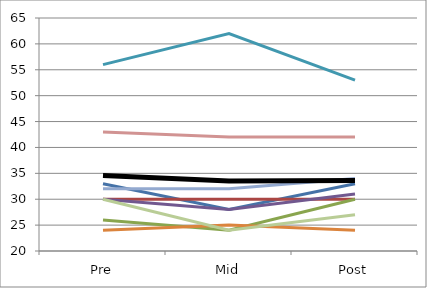
| Category | Series 0 | Series 1 | Series 2 | Series 3 | Series 4 | Series 5 | Series 6 | Series 7 | Series 8 | 34,6 33,5 33,6 |
|---|---|---|---|---|---|---|---|---|---|---|
| Pre | 33 | 30 | 26 | 30 | 56 | 24 | 32 | 43 | 30 | 34.6 |
| Mid | 28 | 30 | 24 | 28 | 62 | 25 | 32 | 42 | 24 | 33.5 |
| Post | 33 | 30 | 30 | 31 | 53 | 24 | 34 | 42 | 27 | 33.6 |